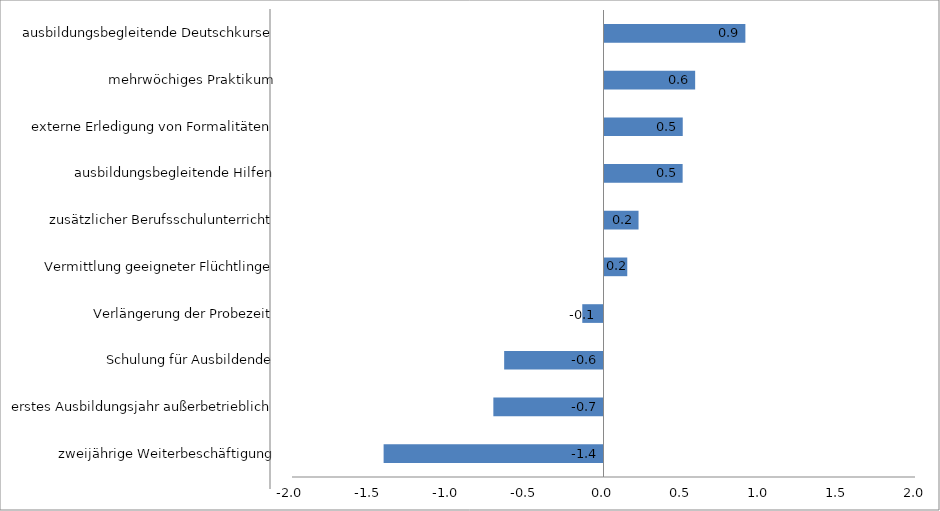
| Category | Series 0 |
|---|---|
| zweijährige Weiterbeschäftigung | -1.412 |
| erstes Ausbildungsjahr außerbetrieblich | -0.707 |
| Schulung für Ausbildende | -0.638 |
| Verlängerung der Probezeit | -0.136 |
| Vermittlung geeigneter Flüchtlinge | 0.153 |
| zusätzlicher Berufsschulunterricht | 0.225 |
| ausbildungsbegleitende Hilfen | 0.508 |
| externe Erledigung von Formalitäten | 0.509 |
| mehrwöchiges Praktikum | 0.588 |
| ausbildungsbegleitende Deutschkurse | 0.911 |